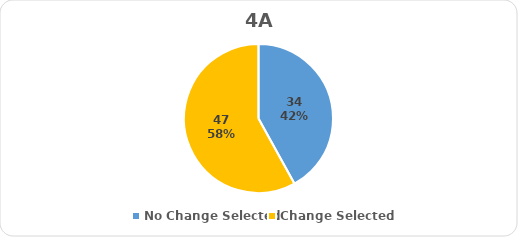
| Category | Series 0 |
|---|---|
| No Change Selected | 34 |
| Change Selected | 47 |